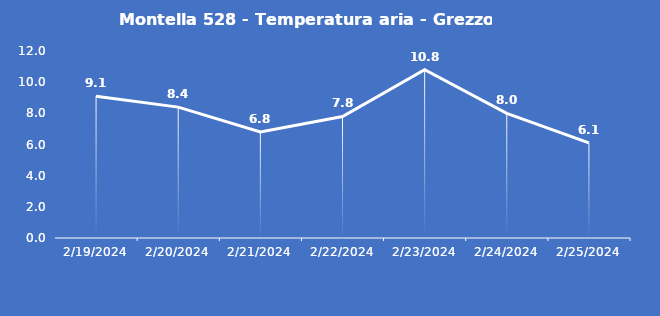
| Category | Montella 528 - Temperatura aria - Grezzo (°C) |
|---|---|
| 2/19/24 | 9.1 |
| 2/20/24 | 8.4 |
| 2/21/24 | 6.8 |
| 2/22/24 | 7.8 |
| 2/23/24 | 10.8 |
| 2/24/24 | 8 |
| 2/25/24 | 6.1 |